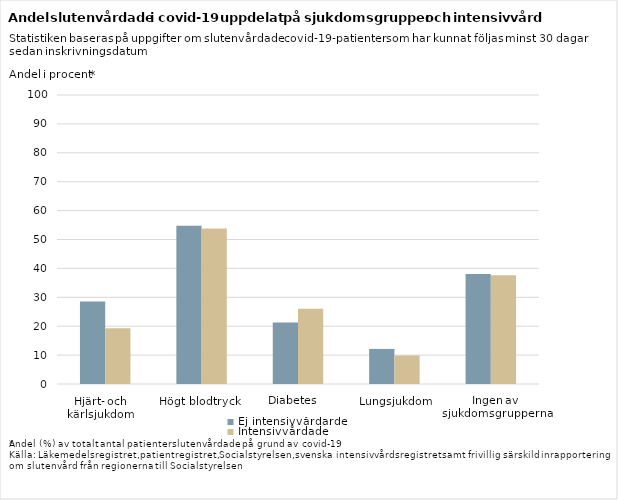
| Category | Ej intensivvårdarde | Intensivvårdade |
|---|---|---|
| Hjärt- och kärlsjukdom | 28.58 | 19.26 |
| Högt blodtryck | 54.8 | 53.8 |
| Diabetes | 21.24 | 26.08 |
| Lungsjukdom | 12.14 | 9.87 |
| Ingen av sjukdomsgrupperna | 38.07 | 37.66 |